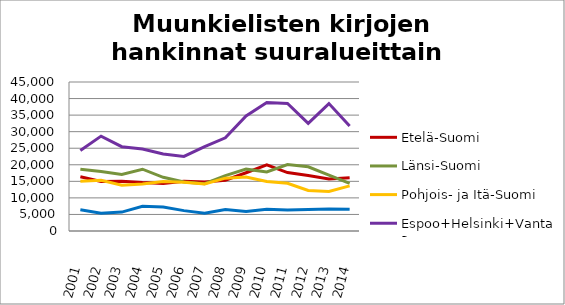
| Category | Etelä-Suomi | Länsi-Suomi | Pohjois- ja Itä-Suomi | Espoo+Helsinki+Vantaa | Muu Uusimaa |
|---|---|---|---|---|---|
| 2001.0 | 16398 | 18638 | 15052 | 24284 | 6388 |
| 2002.0 | 14963 | 17954 | 15290 | 28652 | 5384 |
| 2003.0 | 15035 | 17082 | 13835 | 25463 | 5706 |
| 2004.0 | 14631 | 18662 | 14217 | 24765 | 7482 |
| 2005.0 | 14376 | 16223 | 14982 | 23249 | 7231 |
| 2006.0 | 15010 | 14798 | 14691 | 22517 | 6152 |
| 2007.0 | 14831 | 14265 | 14195 | 25461 | 5370 |
| 2008.0 | 15331 | 16703 | 15955 | 28140 | 6474 |
| 2009.0 | 17599 | 18679 | 16318 | 34732 | 5901 |
| 2010.0 | 19984 | 17840 | 14937 | 38813 | 6541 |
| 2011.0 | 17650 | 20055 | 14419 | 38539 | 6318 |
| 2012.0 | 16770 | 19389 | 12230 | 32496 | 6506 |
| 2013.0 | 15738 | 16877 | 11962 | 38475 | 6655 |
| 2014.0 | 16109 | 14389 | 13631 | 31715 | 6532 |